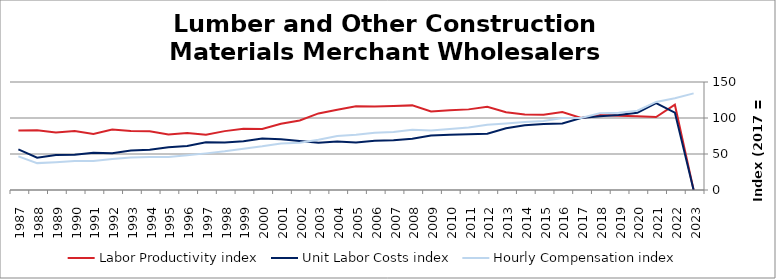
| Category | Labor Productivity index | Unit Labor Costs index | Hourly Compensation index |
|---|---|---|---|
| 2023.0 | 0 | 0 | 134.232 |
| 2022.0 | 118.45 | 107.489 | 127.32 |
| 2021.0 | 101.272 | 120.813 | 122.349 |
| 2020.0 | 102.575 | 107.411 | 110.177 |
| 2019.0 | 103.072 | 104.255 | 107.457 |
| 2018.0 | 104.189 | 102.287 | 106.573 |
| 2017.0 | 100 | 100 | 100 |
| 2016.0 | 108.205 | 92.427 | 100.011 |
| 2015.0 | 104.494 | 91.684 | 95.805 |
| 2014.0 | 104.853 | 90.082 | 94.454 |
| 2013.0 | 108.036 | 85.625 | 92.506 |
| 2012.0 | 115.701 | 78.226 | 90.508 |
| 2011.0 | 111.977 | 77.496 | 86.778 |
| 2010.0 | 110.719 | 76.575 | 84.783 |
| 2009.0 | 109.099 | 75.712 | 82.601 |
| 2008.0 | 117.532 | 71.253 | 83.745 |
| 2007.0 | 116.573 | 69.179 | 80.644 |
| 2006.0 | 115.96 | 68.475 | 79.404 |
| 2005.0 | 116.423 | 65.954 | 76.786 |
| 2004.0 | 111.545 | 67.303 | 75.073 |
| 2003.0 | 106.373 | 65.605 | 69.786 |
| 2002.0 | 96.493 | 68.165 | 65.774 |
| 2001.0 | 91.932 | 70.42 | 64.739 |
| 2000.0 | 84.708 | 71.618 | 60.666 |
| 1999.0 | 84.966 | 67.614 | 57.449 |
| 1998.0 | 81.781 | 65.805 | 53.815 |
| 1997.0 | 76.767 | 66.262 | 50.868 |
| 1996.0 | 79.045 | 61.083 | 48.283 |
| 1995.0 | 77.251 | 59.39 | 45.879 |
| 1994.0 | 81.734 | 55.951 | 45.732 |
| 1993.0 | 81.964 | 54.927 | 45.021 |
| 1992.0 | 83.92 | 51.193 | 42.961 |
| 1991.0 | 77.941 | 51.881 | 40.436 |
| 1990.0 | 81.924 | 49.096 | 40.221 |
| 1989.0 | 79.761 | 48.504 | 38.687 |
| 1988.0 | 83.05 | 44.956 | 37.335 |
| 1987.0 | 82.708 | 56.374 | 46.626 |